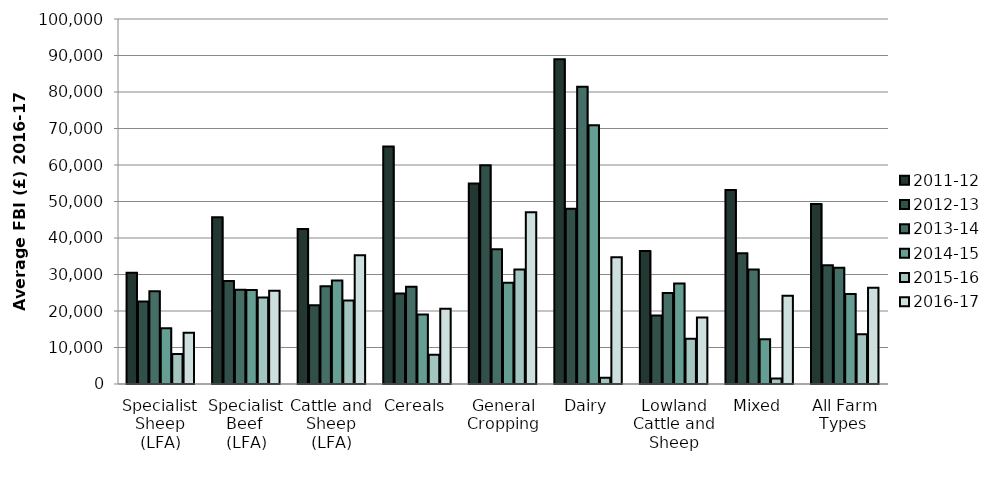
| Category | 2011-12 | 2012-13 | 2013-14 | 2014-15 | 2015-16 | 2016-17 |
|---|---|---|---|---|---|---|
| Specialist Sheep (LFA) | 30508.728 | 22588.264 | 25402.39 | 15253.179 | 8232.884 | 14047.6 |
| Specialist Beef  (LFA) | 45703.497 | 28228.563 | 25827.376 | 25732.583 | 23696.914 | 25564.7 |
| Cattle and Sheep (LFA) | 42498.564 | 21556.164 | 26751.866 | 28339.472 | 22844.778 | 35284.3 |
| Cereals | 65091.181 | 24815.723 | 26641.34 | 19040.677 | 8006.744 | 20589.2 |
| General Cropping | 54932.549 | 59942.891 | 36912.488 | 27763.467 | 31363.581 | 47079.7 |
| Dairy | 88945.595 | 48038.554 | 81464.384 | 70915.189 | 1735.336 | 34696 |
| Lowland Cattle and Sheep | 36406.289 | 18771.84 | 24951.312 | 27508.744 | 12429.389 | 18252.3 |
| Mixed | 53126.05 | 35823.408 | 31347.701 | 12260.401 | 1491.518 | 24167.6 |
| All Farm Types  | 49300.567 | 32554.296 | 31876.011 | 24632.731 | 13633.252 | 26402.3 |